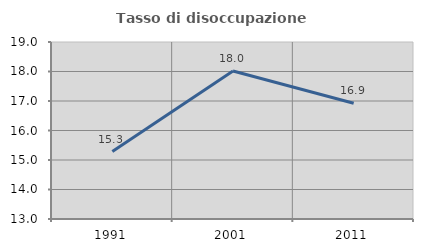
| Category | Tasso di disoccupazione giovanile  |
|---|---|
| 1991.0 | 15.287 |
| 2001.0 | 18.018 |
| 2011.0 | 16.923 |